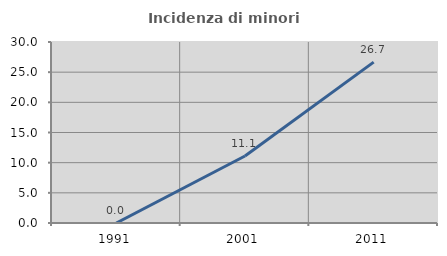
| Category | Incidenza di minori stranieri |
|---|---|
| 1991.0 | 0 |
| 2001.0 | 11.111 |
| 2011.0 | 26.667 |